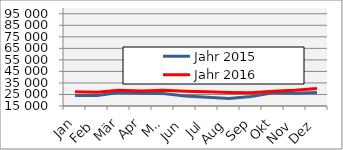
| Category | Jahr 2015 | Jahr 2016 |
|---|---|---|
| 0 | 24035.584 | 27385.313 |
| 1 | 24073.547 | 26952.609 |
| 2 | 26787.309 | 28742.241 |
| 3 | 26000.634 | 27948.055 |
| 4 | 25748.53 | 28558.283 |
| 5 | 23769.616 | 27817.836 |
| 6 | 22562.624 | 27290.549 |
| 7 | 21524.041 | 26665.602 |
| 8 | 23299.038 | 26422.185 |
| 9 | 26517.2 | 27856.934 |
| 10 | 26127.402 | 28611.881 |
| 11 | 26782.914 | 30191.763 |